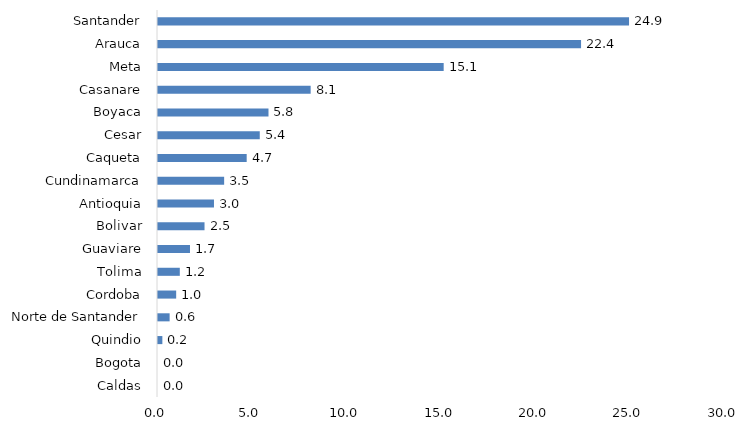
| Category | Series 0 |
|---|---|
| Caldas | 0 |
| Bogota | 0 |
| Quindio | 0.231 |
| Norte de Santander | 0.615 |
| Cordoba | 0.962 |
| Tolima | 1.154 |
| Guaviare | 1.692 |
| Bolivar | 2.462 |
| Antioquia | 2.962 |
| Cundinamarca | 3.5 |
| Caqueta | 4.692 |
| Cesar | 5.385 |
| Boyaca | 5.846 |
| Casanare | 8.077 |
| Meta | 15.115 |
| Arauca | 22.385 |
| Santander | 24.923 |